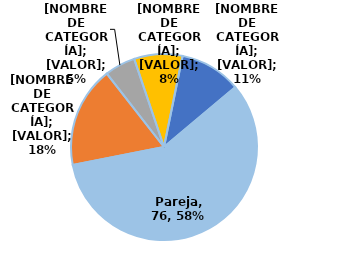
| Category | Series 0 |
|---|---|
| Pareja | 76 |
| Ex pareja | 23 |
| Familiar | 7 |
| Conocido | 11 |
| Desconocido | 14 |